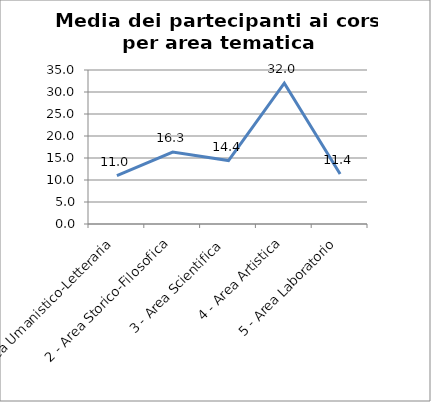
| Category | Media dei partecipanti ai corsi |
|---|---|
| 1 - Area Umanistico-Letteraria | 11 |
| 2 - Area Storico-Filosofica | 16.333 |
| 3 - Area Scientifica | 14.429 |
| 4 - Area Artistica | 32 |
| 5 - Area Laboratorio | 11.35 |